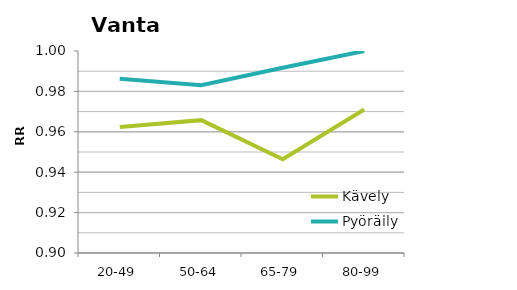
| Category | Kävely | Pyöräily |
|---|---|---|
| 20-49 | 0.962 | 0.986 |
| 50-64 | 0.966 | 0.983 |
| 65-79 | 0.946 | 0.992 |
| 80-99 | 0.971 | 1 |